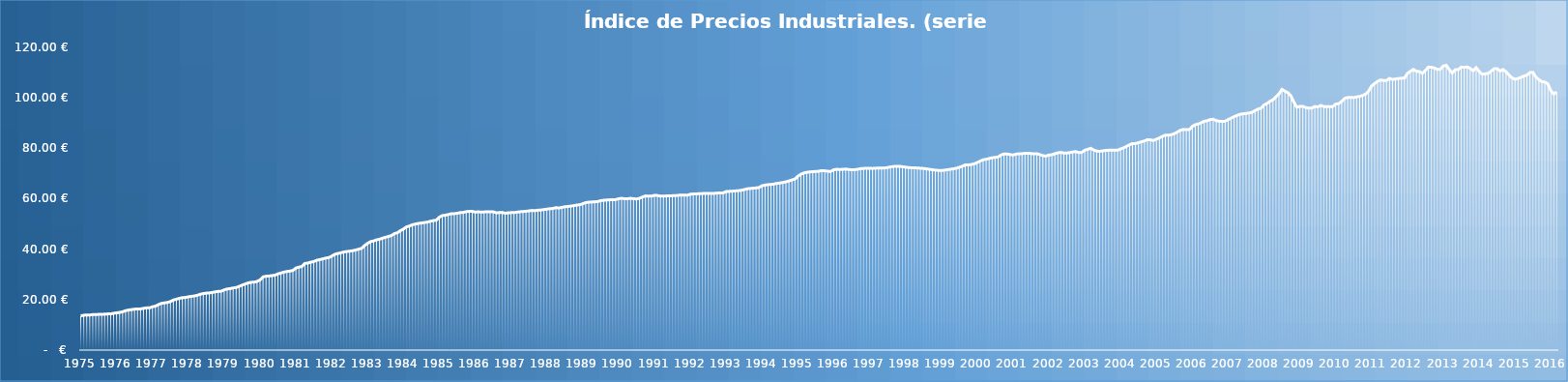
| Category | Índice de Precios Industriales. |
|---|---|
| 1975-01-01 | 13.562 |
| 1975-02-01 | 13.82 |
| 1975-03-01 | 13.906 |
| 1975-04-01 | 13.906 |
| 1975-05-01 | 14.077 |
| 1975-06-01 | 14.077 |
| 1975-07-01 | 14.163 |
| 1975-08-01 | 14.163 |
| 1975-09-01 | 14.249 |
| 1975-10-01 | 14.335 |
| 1975-11-01 | 14.335 |
| 1975-12-01 | 14.592 |
| 1976-01-01 | 14.764 |
| 1976-02-01 | 14.936 |
| 1976-03-01 | 15.193 |
| 1976-04-01 | 15.622 |
| 1976-05-01 | 15.88 |
| 1976-06-01 | 16.052 |
| 1976-07-01 | 16.223 |
| 1976-08-01 | 16.309 |
| 1976-09-01 | 16.309 |
| 1976-10-01 | 16.567 |
| 1976-11-01 | 16.738 |
| 1976-12-01 | 16.738 |
| 1977-01-01 | 17.167 |
| 1977-02-01 | 17.425 |
| 1977-03-01 | 18.026 |
| 1977-04-01 | 18.541 |
| 1977-05-01 | 18.713 |
| 1977-06-01 | 18.884 |
| 1977-07-01 | 19.228 |
| 1977-08-01 | 19.828 |
| 1977-09-01 | 20.172 |
| 1977-10-01 | 20.515 |
| 1977-11-01 | 20.773 |
| 1977-12-01 | 20.858 |
| 1978-01-01 | 21.116 |
| 1978-02-01 | 21.288 |
| 1978-03-01 | 21.459 |
| 1978-04-01 | 21.717 |
| 1978-05-01 | 22.146 |
| 1978-06-01 | 22.404 |
| 1978-07-01 | 22.575 |
| 1978-08-01 | 22.661 |
| 1978-09-01 | 22.833 |
| 1978-10-01 | 23.09 |
| 1978-11-01 | 23.262 |
| 1978-12-01 | 23.348 |
| 1979-01-01 | 23.863 |
| 1979-02-01 | 24.206 |
| 1979-03-01 | 24.378 |
| 1979-04-01 | 24.635 |
| 1979-05-01 | 24.807 |
| 1979-06-01 | 25.236 |
| 1979-07-01 | 25.751 |
| 1979-08-01 | 26.18 |
| 1979-09-01 | 26.61 |
| 1979-10-01 | 26.867 |
| 1979-11-01 | 26.953 |
| 1979-12-01 | 27.21 |
| 1980-01-01 | 27.811 |
| 1980-02-01 | 29.013 |
| 1980-03-01 | 29.271 |
| 1980-04-01 | 29.356 |
| 1980-05-01 | 29.528 |
| 1980-06-01 | 29.7 |
| 1980-07-01 | 30.215 |
| 1980-08-01 | 30.558 |
| 1980-09-01 | 30.901 |
| 1980-10-01 | 31.159 |
| 1980-11-01 | 31.331 |
| 1980-12-01 | 31.588 |
| 1981-01-01 | 32.532 |
| 1981-02-01 | 32.876 |
| 1981-03-01 | 33.133 |
| 1981-04-01 | 34.335 |
| 1981-05-01 | 34.507 |
| 1981-06-01 | 34.85 |
| 1981-07-01 | 35.107 |
| 1981-08-01 | 35.623 |
| 1981-09-01 | 35.88 |
| 1981-10-01 | 36.138 |
| 1981-11-01 | 36.481 |
| 1981-12-01 | 36.653 |
| 1982-01-01 | 37.253 |
| 1982-02-01 | 37.94 |
| 1982-03-01 | 38.283 |
| 1982-04-01 | 38.541 |
| 1982-05-01 | 38.884 |
| 1982-06-01 | 39.056 |
| 1982-07-01 | 39.228 |
| 1982-08-01 | 39.399 |
| 1982-09-01 | 39.657 |
| 1982-10-01 | 40 |
| 1982-11-01 | 40.344 |
| 1982-12-01 | 41.459 |
| 1983-01-01 | 42.318 |
| 1983-02-01 | 43.005 |
| 1983-03-01 | 43.262 |
| 1983-04-01 | 43.691 |
| 1983-05-01 | 43.949 |
| 1983-06-01 | 44.378 |
| 1983-07-01 | 44.721 |
| 1983-08-01 | 45.065 |
| 1983-09-01 | 45.408 |
| 1983-10-01 | 46.18 |
| 1983-11-01 | 46.524 |
| 1983-12-01 | 47.382 |
| 1984-01-01 | 47.983 |
| 1984-02-01 | 48.841 |
| 1984-03-01 | 49.185 |
| 1984-04-01 | 49.7 |
| 1984-05-01 | 49.957 |
| 1984-06-01 | 50.215 |
| 1984-07-01 | 50.387 |
| 1984-08-01 | 50.558 |
| 1984-09-01 | 50.73 |
| 1984-10-01 | 51.073 |
| 1984-11-01 | 51.331 |
| 1984-12-01 | 51.502 |
| 1985-01-01 | 52.704 |
| 1985-02-01 | 53.305 |
| 1985-03-01 | 53.477 |
| 1985-04-01 | 53.734 |
| 1985-05-01 | 54.078 |
| 1985-06-01 | 54.078 |
| 1985-07-01 | 54.249 |
| 1985-08-01 | 54.507 |
| 1985-09-01 | 54.593 |
| 1985-10-01 | 54.85 |
| 1985-11-01 | 55.022 |
| 1985-12-01 | 55.022 |
| 1986-01-01 | 54.678 |
| 1986-02-01 | 54.85 |
| 1986-03-01 | 54.678 |
| 1986-04-01 | 54.764 |
| 1986-05-01 | 54.85 |
| 1986-06-01 | 54.85 |
| 1986-07-01 | 54.85 |
| 1986-08-01 | 54.421 |
| 1986-09-01 | 54.507 |
| 1986-10-01 | 54.593 |
| 1986-11-01 | 54.249 |
| 1986-12-01 | 54.421 |
| 1987-01-01 | 54.507 |
| 1987-02-01 | 54.507 |
| 1987-03-01 | 54.678 |
| 1987-04-01 | 54.85 |
| 1987-05-01 | 54.936 |
| 1987-06-01 | 55.022 |
| 1987-07-01 | 55.193 |
| 1987-08-01 | 55.365 |
| 1987-09-01 | 55.279 |
| 1987-10-01 | 55.451 |
| 1987-11-01 | 55.537 |
| 1987-12-01 | 55.708 |
| 1988-01-01 | 55.88 |
| 1988-02-01 | 56.052 |
| 1988-03-01 | 56.138 |
| 1988-04-01 | 56.481 |
| 1988-05-01 | 56.309 |
| 1988-06-01 | 56.567 |
| 1988-07-01 | 56.824 |
| 1988-08-01 | 56.91 |
| 1988-09-01 | 57.082 |
| 1988-10-01 | 57.254 |
| 1988-11-01 | 57.511 |
| 1988-12-01 | 57.597 |
| 1989-01-01 | 58.026 |
| 1989-02-01 | 58.455 |
| 1989-03-01 | 58.627 |
| 1989-04-01 | 58.713 |
| 1989-05-01 | 58.799 |
| 1989-06-01 | 58.884 |
| 1989-07-01 | 59.228 |
| 1989-08-01 | 59.399 |
| 1989-09-01 | 59.485 |
| 1989-10-01 | 59.571 |
| 1989-11-01 | 59.657 |
| 1989-12-01 | 59.657 |
| 1990-01-01 | 60 |
| 1990-02-01 | 60.172 |
| 1990-03-01 | 60 |
| 1990-04-01 | 60 |
| 1990-05-01 | 60.172 |
| 1990-06-01 | 60 |
| 1990-07-01 | 59.914 |
| 1990-08-01 | 60.172 |
| 1990-09-01 | 60.687 |
| 1990-10-01 | 61.116 |
| 1990-11-01 | 61.03 |
| 1990-12-01 | 61.03 |
| 1991-01-01 | 61.374 |
| 1991-02-01 | 61.288 |
| 1991-03-01 | 61.03 |
| 1991-04-01 | 61.03 |
| 1991-05-01 | 61.116 |
| 1991-06-01 | 61.116 |
| 1991-07-01 | 61.202 |
| 1991-08-01 | 61.202 |
| 1991-09-01 | 61.374 |
| 1991-10-01 | 61.46 |
| 1991-11-01 | 61.46 |
| 1991-12-01 | 61.374 |
| 1992-01-01 | 61.803 |
| 1992-02-01 | 61.889 |
| 1992-03-01 | 61.889 |
| 1992-04-01 | 62.06 |
| 1992-05-01 | 62.06 |
| 1992-06-01 | 62.146 |
| 1992-07-01 | 62.146 |
| 1992-08-01 | 62.146 |
| 1992-09-01 | 62.146 |
| 1992-10-01 | 62.232 |
| 1992-11-01 | 62.318 |
| 1992-12-01 | 62.318 |
| 1993-01-01 | 62.833 |
| 1993-02-01 | 62.919 |
| 1993-03-01 | 63.005 |
| 1993-04-01 | 63.09 |
| 1993-05-01 | 63.176 |
| 1993-06-01 | 63.348 |
| 1993-07-01 | 63.605 |
| 1993-08-01 | 63.949 |
| 1993-09-01 | 64.035 |
| 1993-10-01 | 64.206 |
| 1993-11-01 | 64.292 |
| 1993-12-01 | 64.464 |
| 1994-01-01 | 65.151 |
| 1994-02-01 | 65.408 |
| 1994-03-01 | 65.58 |
| 1994-04-01 | 65.666 |
| 1994-05-01 | 65.837 |
| 1994-06-01 | 66.095 |
| 1994-07-01 | 66.266 |
| 1994-08-01 | 66.438 |
| 1994-09-01 | 66.696 |
| 1994-10-01 | 67.039 |
| 1994-11-01 | 67.468 |
| 1994-12-01 | 67.812 |
| 1995-01-01 | 68.927 |
| 1995-02-01 | 69.7 |
| 1995-03-01 | 70.215 |
| 1995-04-01 | 70.472 |
| 1995-05-01 | 70.644 |
| 1995-06-01 | 70.73 |
| 1995-07-01 | 70.816 |
| 1995-08-01 | 70.902 |
| 1995-09-01 | 71.159 |
| 1995-10-01 | 71.073 |
| 1995-11-01 | 70.902 |
| 1995-12-01 | 70.816 |
| 1996-01-01 | 71.503 |
| 1996-02-01 | 71.674 |
| 1996-03-01 | 71.588 |
| 1996-04-01 | 71.674 |
| 1996-05-01 | 71.76 |
| 1996-06-01 | 71.588 |
| 1996-07-01 | 71.503 |
| 1996-08-01 | 71.503 |
| 1996-09-01 | 71.674 |
| 1996-10-01 | 71.932 |
| 1996-11-01 | 72.018 |
| 1996-12-01 | 72.103 |
| 1997-01-01 | 72.103 |
| 1997-02-01 | 72.018 |
| 1997-03-01 | 72.103 |
| 1997-04-01 | 72.189 |
| 1997-05-01 | 72.189 |
| 1997-06-01 | 72.189 |
| 1997-07-01 | 72.361 |
| 1997-08-01 | 72.618 |
| 1997-09-01 | 72.79 |
| 1997-10-01 | 72.876 |
| 1997-11-01 | 72.876 |
| 1997-12-01 | 72.704 |
| 1998-01-01 | 72.533 |
| 1998-02-01 | 72.361 |
| 1998-03-01 | 72.275 |
| 1998-04-01 | 72.275 |
| 1998-05-01 | 72.189 |
| 1998-06-01 | 72.103 |
| 1998-07-01 | 72.018 |
| 1998-08-01 | 71.846 |
| 1998-09-01 | 71.674 |
| 1998-10-01 | 71.503 |
| 1998-11-01 | 71.331 |
| 1998-12-01 | 71.245 |
| 1999-01-01 | 71.159 |
| 1999-02-01 | 71.331 |
| 1999-03-01 | 71.503 |
| 1999-04-01 | 71.674 |
| 1999-05-01 | 71.846 |
| 1999-06-01 | 72.103 |
| 1999-07-01 | 72.447 |
| 1999-08-01 | 72.876 |
| 1999-09-01 | 73.391 |
| 1999-10-01 | 73.391 |
| 1999-11-01 | 73.563 |
| 1999-12-01 | 73.82 |
| 2000-01-01 | 74.335 |
| 2000-02-01 | 74.936 |
| 2000-03-01 | 75.451 |
| 2000-04-01 | 75.623 |
| 2000-05-01 | 75.966 |
| 2000-06-01 | 76.224 |
| 2000-07-01 | 76.395 |
| 2000-08-01 | 76.567 |
| 2000-09-01 | 77.339 |
| 2000-10-01 | 77.769 |
| 2000-11-01 | 77.769 |
| 2000-12-01 | 77.511 |
| 2001-01-01 | 77.339 |
| 2001-02-01 | 77.683 |
| 2001-03-01 | 77.854 |
| 2001-04-01 | 77.854 |
| 2001-05-01 | 78.026 |
| 2001-06-01 | 78.026 |
| 2001-07-01 | 77.94 |
| 2001-08-01 | 77.769 |
| 2001-09-01 | 77.854 |
| 2001-10-01 | 77.511 |
| 2001-11-01 | 77.082 |
| 2001-12-01 | 76.91 |
| 2002-01-01 | 77.339 |
| 2002-02-01 | 77.425 |
| 2002-03-01 | 77.854 |
| 2002-04-01 | 78.198 |
| 2002-05-01 | 78.37 |
| 2002-06-01 | 78.112 |
| 2002-07-01 | 78.112 |
| 2002-08-01 | 78.284 |
| 2002-09-01 | 78.541 |
| 2002-10-01 | 78.713 |
| 2002-11-01 | 78.284 |
| 2002-12-01 | 78.37 |
| 2003-01-01 | 79.228 |
| 2003-02-01 | 79.571 |
| 2003-03-01 | 80 |
| 2003-04-01 | 79.314 |
| 2003-05-01 | 78.885 |
| 2003-06-01 | 78.799 |
| 2003-07-01 | 78.97 |
| 2003-08-01 | 79.142 |
| 2003-09-01 | 79.228 |
| 2003-10-01 | 79.228 |
| 2003-11-01 | 79.314 |
| 2003-12-01 | 79.228 |
| 2004-01-01 | 79.743 |
| 2004-02-01 | 80.172 |
| 2004-03-01 | 80.773 |
| 2004-04-01 | 81.374 |
| 2004-05-01 | 81.889 |
| 2004-06-01 | 81.889 |
| 2004-07-01 | 82.232 |
| 2004-08-01 | 82.576 |
| 2004-09-01 | 82.919 |
| 2004-10-01 | 83.434 |
| 2004-11-01 | 83.348 |
| 2004-12-01 | 83.091 |
| 2005-01-01 | 83.606 |
| 2005-02-01 | 84.121 |
| 2005-03-01 | 84.721 |
| 2005-04-01 | 85.236 |
| 2005-05-01 | 85.151 |
| 2005-06-01 | 85.408 |
| 2005-07-01 | 85.837 |
| 2005-08-01 | 86.438 |
| 2005-09-01 | 87.125 |
| 2005-10-01 | 87.468 |
| 2005-11-01 | 87.382 |
| 2005-12-01 | 87.382 |
| 2006-01-01 | 88.67 |
| 2006-02-01 | 89.357 |
| 2006-03-01 | 89.614 |
| 2006-04-01 | 90.129 |
| 2006-05-01 | 90.73 |
| 2006-06-01 | 90.902 |
| 2006-07-01 | 91.417 |
| 2006-08-01 | 91.503 |
| 2006-09-01 | 90.988 |
| 2006-10-01 | 90.73 |
| 2006-11-01 | 90.644 |
| 2006-12-01 | 90.73 |
| 2007-01-01 | 91.417 |
| 2007-02-01 | 91.932 |
| 2007-03-01 | 92.533 |
| 2007-04-01 | 93.048 |
| 2007-05-01 | 93.477 |
| 2007-06-01 | 93.649 |
| 2007-07-01 | 93.82 |
| 2007-08-01 | 93.992 |
| 2007-09-01 | 94.249 |
| 2007-10-01 | 94.936 |
| 2007-11-01 | 95.537 |
| 2007-12-01 | 95.88 |
| 2008-01-01 | 97.168 |
| 2008-02-01 | 97.769 |
| 2008-03-01 | 98.627 |
| 2008-04-01 | 99.228 |
| 2008-05-01 | 100.43 |
| 2008-06-01 | 101.546 |
| 2008-07-01 | 103.348 |
| 2008-08-01 | 102.661 |
| 2008-09-01 | 102.061 |
| 2008-10-01 | 100.773 |
| 2008-11-01 | 98.284 |
| 2008-12-01 | 96.224 |
| 2009-01-01 | 96.653 |
| 2009-02-01 | 96.653 |
| 2009-03-01 | 96.138 |
| 2009-04-01 | 95.88 |
| 2009-05-01 | 95.966 |
| 2009-06-01 | 96.567 |
| 2009-07-01 | 96.395 |
| 2009-08-01 | 96.996 |
| 2009-09-01 | 96.567 |
| 2009-10-01 | 96.481 |
| 2009-11-01 | 96.481 |
| 2009-12-01 | 96.567 |
| 2010-01-01 | 97.511 |
| 2010-02-01 | 97.715 |
| 2010-03-01 | 98.566 |
| 2010-04-01 | 99.814 |
| 2010-05-01 | 100.104 |
| 2010-06-01 | 100.181 |
| 2010-07-01 | 100.084 |
| 2010-08-01 | 100.363 |
| 2010-09-01 | 100.566 |
| 2010-10-01 | 100.937 |
| 2010-11-01 | 101.486 |
| 2010-12-01 | 102.672 |
| 2011-01-01 | 104.654 |
| 2011-02-01 | 105.676 |
| 2011-03-01 | 106.506 |
| 2011-04-01 | 107.094 |
| 2011-05-01 | 106.832 |
| 2011-06-01 | 106.865 |
| 2011-07-01 | 107.692 |
| 2011-08-01 | 107.277 |
| 2011-09-01 | 107.482 |
| 2011-10-01 | 107.641 |
| 2011-11-01 | 107.779 |
| 2011-12-01 | 107.789 |
| 2012-01-01 | 109.706 |
| 2012-02-01 | 110.513 |
| 2012-03-01 | 111.27 |
| 2012-04-01 | 110.523 |
| 2012-05-01 | 110.423 |
| 2012-06-01 | 109.732 |
| 2012-07-01 | 110.824 |
| 2012-08-01 | 112.19 |
| 2012-09-01 | 112.102 |
| 2012-10-01 | 111.87 |
| 2012-11-01 | 111.289 |
| 2012-12-01 | 111.307 |
| 2013-01-01 | 112.628 |
| 2013-02-01 | 112.896 |
| 2013-03-01 | 111.211 |
| 2013-04-01 | 109.868 |
| 2013-05-01 | 111.145 |
| 2013-06-01 | 111.176 |
| 2013-07-01 | 112.194 |
| 2013-08-01 | 112.077 |
| 2013-09-01 | 112.263 |
| 2013-10-01 | 111.684 |
| 2013-11-01 | 110.734 |
| 2013-12-01 | 111.986 |
| 2014-01-01 | 110.468 |
| 2014-02-01 | 109.359 |
| 2014-03-01 | 109.521 |
| 2014-04-01 | 109.661 |
| 2014-05-01 | 110.587 |
| 2014-06-01 | 111.532 |
| 2014-07-01 | 111.593 |
| 2014-08-01 | 110.633 |
| 2014-09-01 | 111.253 |
| 2014-10-01 | 110.346 |
| 2014-11-01 | 109.072 |
| 2014-12-01 | 107.92 |
| 2015-01-01 | 107.399 |
| 2015-02-01 | 107.657 |
| 2015-03-01 | 108.142 |
| 2015-04-01 | 108.647 |
| 2015-05-01 | 109.019 |
| 2015-06-01 | 110.008 |
| 2015-07-01 | 110.113 |
| 2015-08-01 | 108.212 |
| 2015-09-01 | 107.223 |
| 2015-10-01 | 106.414 |
| 2015-11-01 | 106.254 |
| 2015-12-01 | 105.518 |
| 2016-01-01 | 102.848 |
| 2016-02-01 | 101.562 |
| 2016-03-01 | 102.28 |